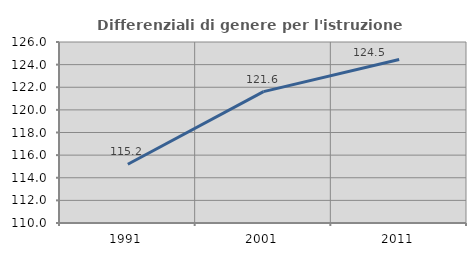
| Category | Differenziali di genere per l'istruzione superiore |
|---|---|
| 1991.0 | 115.189 |
| 2001.0 | 121.613 |
| 2011.0 | 124.457 |